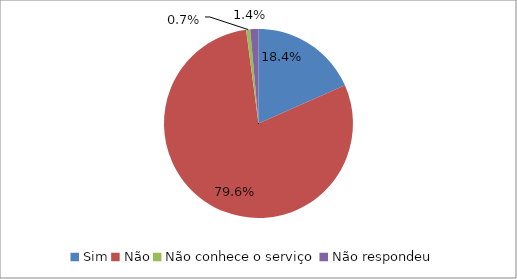
| Category | Series 0 |
|---|---|
| Sim | 0.184 |
| Não | 0.796 |
| Não conhece o serviço | 0.007 |
| Não respondeu | 0.014 |